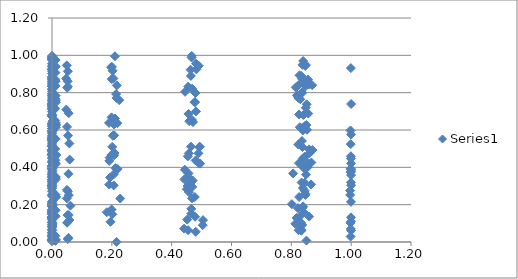
| Category | Series 0 |
|---|---|
| 2.1234767190230094e-10 | 0.426 |
| 2.1823215421288188e-10 | 0.995 |
| 2.456668731822884e-10 | 0.924 |
| 2.4958728359406744e-10 | 0.549 |
| 2.524520583579849e-10 | 0.253 |
| 2.564782472251878e-10 | 0.204 |
| 2.870732689011217e-10 | 0.834 |
| 2.885965554783698e-10 | 0.47 |
| 2.9653796850900167e-10 | 0.982 |
| 3.3178842842110586e-10 | 0.126 |
| 3.3704681758625977e-10 | 0.903 |
| 3.893393559864688e-10 | 0.345 |
| 1.2585277097562478e-08 | 0.543 |
| 1.2900032388252745e-08 | 0.58 |
| 1.3223297873098933e-08 | 0.049 |
| 1.3553554375008077e-08 | 0.816 |
| 1.4356809921003133e-08 | 0.449 |
| 1.4563627409916188e-08 | 0.465 |
| 1.4714552239303248e-08 | 0.729 |
| 1.4926377636556912e-08 | 0.941 |
| 1.508193313565005e-08 | 0.351 |
| 1.5298897629811785e-08 | 0.699 |
| 1.545722449196362e-08 | 0.485 |
| 1.5679434919269443e-08 | 0.598 |
| 1.6525656855001448e-08 | 0.983 |
| 1.6604825753960116e-08 | 0.297 |
| 1.7016893079949853e-08 | 0.163 |
| 1.7356982117070712e-08 | 0.104 |
| 1.744001937821129e-08 | 0.492 |
| 1.7872212247342826e-08 | 0.194 |
| 1.883316387776934e-08 | 0.068 |
| 1.9102404356092215e-08 | 0.305 |
| 1.9777019070746364e-08 | 0.82 |
| 2.0059361231105254e-08 | 0.333 |
| 2.1758160864438958e-08 | 0.542 |
| 2.2844060947465533e-08 | 0.47 |
| 2.962953792870785e-07 | 0.885 |
| 2.9914148461965643e-07 | 0.796 |
| 3.030237865761576e-07 | 0.216 |
| 3.0593233696316057e-07 | 0.555 |
| 3.339704131807069e-07 | 0.433 |
| 3.3716555028355905e-07 | 0.214 |
| 3.3833927319173687e-07 | 0.326 |
| 3.415237559408568e-07 | 0.836 |
| 3.4157478989468423e-07 | 0.159 |
| 3.4478869366710227e-07 | 0.783 |
| 3.4598805156196545e-07 | 0.407 |
| 3.4929421769274587e-07 | 0.858 |
| 3.7950698414280907e-07 | 0.511 |
| 3.8115807225130017e-07 | 0.167 |
| 3.8312210460805484e-07 | 0.009 |
| 3.847883849843472e-07 | 0.136 |
| 3.897399210303014e-07 | 0.681 |
| 3.9344916017753127e-07 | 0.391 |
| 4.273387489324025e-07 | 0.955 |
| 4.3139305175869927e-07 | 0.607 |
| 4.3288230333119326e-07 | 0.172 |
| 4.36987385794526e-07 | 0.681 |
| 4.871827784615834e-07 | 0.085 |
| 4.917840411651853e-07 | 0.515 |
| 5.158962842546905e-07 | 0.872 |
| 5.273908661378575e-07 | 0.153 |
| 5.801973006099032e-07 | 0.569 |
| 5.876443763341788e-07 | 0.374 |
| 5.930714119427855e-07 | 0.093 |
| 6.006778745503318e-07 | 0.194 |
| 6.577298205096262e-07 | 0.738 |
| 6.605375070208675e-07 | 0.062 |
| 6.751272164192693e-07 | 0.491 |
| 7.389758113266109e-07 | 0.149 |
| 7.483801208181899e-07 | 0.806 |
| 8.403777160192567e-07 | 0.406 |
| 8.168316353291611e-06 | 0.625 |
| 8.237543187333576e-06 | 0.028 |
| 8.331844850307904e-06 | 0.862 |
| 8.402397568946187e-06 | 0.755 |
| 8.498948040573692e-06 | 0.106 |
| 8.570854370742046e-06 | 0.794 |
| 8.668804359627521e-06 | 0.76 |
| 8.74208532557326e-06 | 0.015 |
| 9.078450680558126e-06 | 0.731 |
| 9.155041731903718e-06 | 0.052 |
| 9.183154892721936e-06 | 0.131 |
| 9.25937014669387e-06 | 0.394 |
| 9.260590849672614e-06 | 0.53 |
| 9.337420832848237e-06 | 0.272 |
| 9.366069614949815e-06 | 0.636 |
| 9.444227167936512e-06 | 0.672 |
| 9.444980505779504e-06 | 0.013 |
| 9.523767866033207e-06 | 0.03 |
| 9.552963413550078e-06 | 0.19 |
| 9.632112238516318e-06 | 0.619 |
| 9.633379917639643e-06 | 0.393 |
| 9.713165942292591e-06 | 0.4 |
| 9.742916689886628e-06 | 0.915 |
| 9.824862025331277e-06 | 0.287 |
| 1.016197544449026e-05 | 0.785 |
| 1.0200951752832855e-05 | 0.301 |
| 1.0247288593686599e-05 | 0.878 |
| 1.0286577799517056e-05 | 0.496 |
| 1.0403207174730093e-05 | 0.589 |
| 1.0490455995197467e-05 | 0.29 |
| 1.0569373670954163e-05 | 0.835 |
| 1.0609843058416983e-05 | 0.149 |
| 1.0657954581693425e-05 | 0.129 |
| 1.069874824385099e-05 | 0.3 |
| 1.0819841937779522e-05 | 0.033 |
| 1.0910428865148664e-05 | 0.135 |
| 1.1283055302197367e-05 | 0.631 |
| 1.1377346309905233e-05 | 0.745 |
| 1.1411954388964274e-05 | 0.56 |
| 1.1507274824080777e-05 | 0.409 |
| 1.1733292285498697e-05 | 0.71 |
| 1.1831176597832995e-05 | 0.015 |
| 1.1867103178719244e-05 | 0.325 |
| 1.1966054131065482e-05 | 0.038 |
| 1.2664212741042147e-05 | 0.979 |
| 1.2769505812179599e-05 | 0.925 |
| 1.3166942836957334e-05 | 0.334 |
| 1.3276225776885104e-05 | 0.552 |
| 0.00010078741003635494 | 0.849 |
| 0.00010257360776560601 | 0.49 |
| 0.00011067686671965149 | 0.119 |
| 0.00011180675246643151 | 0.205 |
| 0.00011262823636286894 | 0.975 |
| 0.00011377693385019935 | 0.678 |
| 0.00012229719423028143 | 0.363 |
| 0.00012271232885843365 | 0.006 |
| 0.00012486349102413654 | 0.683 |
| 0.00013210220689575646 | 0.005 |
| 0.00013416413977041425 | 0.609 |
| 0.00013551918064536573 | 0.939 |
| 0.00014486286270495028 | 0.082 |
| 0.0001463196175609976 | 0.513 |
| 0.0001485902518405211 | 0.468 |
| 0.00015423402247686702 | 0.251 |
| 0.00015536475922298262 | 0.311 |
| 0.0001569029090660761 | 0.081 |
| 0.00015711821260880348 | 0.996 |
| 0.00015805208311582772 | 0.407 |
| 0.00015983411047032852 | 0.552 |
| 0.00016036852775085997 | 0.492 |
| 0.00016899642213121302 | 0.157 |
| 0.0001702288933191096 | 0.476 |
| 0.00017068091116004505 | 0.317 |
| 0.00017190535384682088 | 0.564 |
| 0.00017192495349044014 | 0.881 |
| 0.000172140010254623 | 0.204 |
| 0.0001731578025000386 | 0.846 |
| 0.0001736171448556469 | 0.52 |
| 0.00017385400233146334 | 0.772 |
| 0.00017488133917184086 | 0.736 |
| 0.00017509987862937736 | 0.362 |
| 0.00017684161747491783 | 0.365 |
| 0.00018630090356949708 | 0.594 |
| 0.0001869183213392837 | 0.716 |
| 0.0001876518988364364 | 0.05 |
| 0.00018827353180017045 | 0.989 |
| 0.00019011685065862665 | 0.451 |
| 0.00019037485358670863 | 0.171 |
| 0.00019149388333101173 | 0.741 |
| 0.0001936290210585602 | 0.198 |
| 0.00020393025979587235 | 0.104 |
| 0.00020540126274414517 | 0.723 |
| 0.00020594073307812606 | 0.927 |
| 0.00020742537710504122 | 0.127 |
| 0.00022530901047051278 | 0.608 |
| 0.0002269246262083097 | 0.591 |
| 0.0012909806634268117 | 0.715 |
| 0.0013104059790640687 | 0.99 |
| 0.0013301535400527089 | 0.195 |
| 0.0013501229074871421 | 0.197 |
| 0.0013978687045086333 | 0.871 |
| 0.0014099811686791091 | 0.132 |
| 0.0014187752138500186 | 0.381 |
| 0.0014310548764355294 | 0.721 |
| 0.0014400264884734239 | 0.992 |
| 0.0014524758815815466 | 0.762 |
| 0.0014615143847470883 | 0.635 |
| 0.0014741351705690152 | 0.355 |
| 0.0015215304335350788 | 0.595 |
| 0.0015259122221885034 | 0.395 |
| 0.0015485798687124859 | 0.568 |
| 0.0015671160807445791 | 0.635 |
| 0.0015716188547498168 | 0.944 |
| 0.0015949118717146502 | 0.091 |
| 0.0016458743404557826 | 0.786 |
| 0.001659956641392135 | 0.796 |
| 0.001694881189109842 | 0.097 |
| 0.001709349415770434 | 0.349 |
| 0.001794660771524913 | 0.647 |
| 0.001847730105941138 | 0.244 |
| 0.009984454081129612 | 0.553 |
| 0.010037427237062533 | 0.77 |
| 0.010667320288995207 | 0.715 |
| 0.010723507396918032 | 0.651 |
| 0.010744083903059806 | 0.871 |
| 0.010800630509623637 | 0.498 |
| 0.01121560143118987 | 0.006 |
| 0.011306021782250463 | 0.424 |
| 0.011354052069222687 | 0.633 |
| 0.01136518939800352 | 0.033 |
| 0.011445462918333567 | 0.347 |
| 0.011472815165988042 | 0.907 |
| 0.011505278075695782 | 0.254 |
| 0.011532757212461456 | 0.438 |
| 0.01197256897235269 | 0.35 |
| 0.0120576187952362 | 0.765 |
| 0.012068384357979405 | 0.756 |
| 0.012119277892294405 | 0.836 |
| 0.01213107890453863 | 0.238 |
| 0.012154037273891662 | 0.784 |
| 0.012205250870732992 | 0.975 |
| 0.01221613321956823 | 0.17 |
| 0.01221712607051357 | 0.138 |
| 0.012279507588326842 | 0.861 |
| 0.012302714778584519 | 0.552 |
| 0.0123664869799283 | 0.638 |
| 0.012834313919855315 | 0.94 |
| 0.012864589249571977 | 0.418 |
| 0.012966700325791057 | 0.626 |
| 0.013020934894183002 | 0.614 |
| 0.013033510317392224 | 0.337 |
| 0.013124142816255922 | 0.749 |
| 0.013191669778072884 | 0.011 |
| 0.013686954525415494 | 0.243 |
| 0.013782695628377545 | 0.63 |
| 0.0146905456387362 | 0.466 |
| 0.047370274794604386 | 0.876 |
| 0.04785159386174785 | 0.709 |
| 0.04929249002107264 | 0.946 |
| 0.04979004416656974 | 0.234 |
| 0.04998773723249543 | 0.279 |
| 0.05027971197334634 | 0.616 |
| 0.05049112695872016 | 0.103 |
| 0.05078554670805108 | 0.826 |
| 0.05199778330887759 | 0.144 |
| 0.05229948692312298 | 0.861 |
| 0.05251793800924415 | 0.016 |
| 0.05282214457087702 | 0.271 |
| 0.052927264588090696 | 0.832 |
| 0.053029795205902994 | 0.915 |
| 0.05355849722431441 | 0.57 |
| 0.055034648582009286 | 0.022 |
| 0.05514055024077493 | 0.365 |
| 0.055686609797058945 | 0.69 |
| 0.0557964296351573 | 0.144 |
| 0.05611627721968993 | 0.251 |
| 0.05799755116743158 | 0.528 |
| 0.05832777293313517 | 0.118 |
| 0.05912694049708494 | 0.441 |
| 0.06143536575637108 | 0.195 |
| 0.18318458572411697 | 0.16 |
| 0.19067220686008254 | 0.638 |
| 0.19121955502431814 | 0.308 |
| 0.1914997487742797 | 0.434 |
| 0.1926482164878131 | 0.452 |
| 0.19400022082517757 | 0.346 |
| 0.19544328850229595 | 0.108 |
| 0.19747504938627253 | 0.936 |
| 0.19893354095475202 | 0.467 |
| 0.19893595342410872 | 0.668 |
| 0.19922152934020415 | 0.174 |
| 0.1997857863560001 | 0.873 |
| 0.20040187683937832 | 0.938 |
| 0.201258450048353 | 0.509 |
| 0.20179126879077575 | 0.148 |
| 0.20265191982640324 | 0.917 |
| 0.2032740734696121 | 0.569 |
| 0.20413905801134702 | 0.648 |
| 0.20536148775498367 | 0.876 |
| 0.20623254057494966 | 0.303 |
| 0.20686219686741716 | 0.363 |
| 0.20744120784172587 | 0.63 |
| 0.20773510399623984 | 0.465 |
| 0.20773758920216262 | 0.571 |
| 0.20924761189285612 | 0.477 |
| 0.21038189496212734 | 0.995 |
| 0.2106786194193851 | 0.661 |
| 0.21220564363092703 | 0.396 |
| 0.21435496994013067 | 0.792 |
| 0.21559571684292564 | 0.772 |
| 0.2158999465526337 | 0.001 |
| 0.21649598288127095 | 0.839 |
| 0.21861396229234936 | 0.636 |
| 0.21952267514975543 | 0.391 |
| 0.22488709431813247 | 0.76 |
| 0.2279914256223844 | 0.233 |
| 0.4416191548099777 | 0.072 |
| 0.4426041606008622 | 0.336 |
| 0.4439346178955026 | 0.387 |
| 0.4449216096849407 | 0.805 |
| 0.45077868287626444 | 0.283 |
| 0.45177138854146665 | 0.12 |
| 0.45311217416841176 | 0.3 |
| 0.4540351723016773 | 0.459 |
| 0.45410677452705567 | 0.35 |
| 0.4550305145855629 | 0.063 |
| 0.455394060673084 | 0.832 |
| 0.45637483563846415 | 0.686 |
| 0.4563904875100915 | 0.367 |
| 0.4573720395127507 | 0.475 |
| 0.45773626263470973 | 0.267 |
| 0.4587345371502176 | 0.647 |
| 0.463288439954147 | 0.923 |
| 0.4642909846875446 | 0.89 |
| 0.46465714988173734 | 0.511 |
| 0.4656449597941666 | 0.178 |
| 0.46566072356891625 | 0.152 |
| 0.46664927024955166 | 0.988 |
| 0.4670160773915513 | 0.997 |
| 0.4674886708158737 | 0.323 |
| 0.4679490304292352 | 0.654 |
| 0.46802140239561624 | 0.234 |
| 0.4684943433255579 | 0.821 |
| 0.4689550403707317 | 0.295 |
| 0.4703136580586718 | 0.33 |
| 0.4713213844367736 | 0.643 |
| 0.4768353608038024 | 0.748 |
| 0.4772987668383699 | 0.241 |
| 0.4778476754391094 | 0.75 |
| 0.4783113993471143 | 0.135 |
| 0.47967888525850405 | 0.799 |
| 0.4801556813814101 | 0.437 |
| 0.480693133346126 | 0.055 |
| 0.48117024967296085 | 0.699 |
| 0.48154078485662827 | 0.955 |
| 0.4825562768378622 | 0.925 |
| 0.4895825543613378 | 0.475 |
| 0.49060321750806185 | 0.944 |
| 0.49097596649102077 | 0.422 |
| 0.49199749234914386 | 0.508 |
| 0.49432622613540483 | 0.51 |
| 0.49534978590253076 | 0.42 |
| 0.5038338106224641 | 0.09 |
| 0.5048628310268446 | 0.117 |
| 0.8018493176403366 | 0.203 |
| 0.80607384298247 | 0.367 |
| 0.8133962390033009 | 0.098 |
| 0.8146392819198448 | 0.828 |
| 0.8175393427745514 | 0.129 |
| 0.8187732143308741 | 0.786 |
| 0.8211496641435778 | 0.835 |
| 0.822047826347537 | 0.181 |
| 0.8232573474126851 | 0.772 |
| 0.8234255376409202 | 0.522 |
| 0.8241519272544026 | 0.063 |
| 0.8252342222584177 | 0.099 |
| 0.8255240990793956 | 0.422 |
| 0.8259320870467077 | 0.683 |
| 0.8261253931030366 | 0.241 |
| 0.827325429055415 | 0.893 |
| 0.8274922939253511 | 0.136 |
| 0.8282129414663207 | 0.615 |
| 0.8295741860157224 | 0.088 |
| 0.829978904605346 | 0.765 |
| 0.8323041310196968 | 0.103 |
| 0.8331827128560072 | 0.061 |
| 0.8335030369271555 | 0.889 |
| 0.8343656725484362 | 0.064 |
| 0.8343794209239799 | 0.854 |
| 0.8345301516304345 | 0.318 |
| 0.8352404636185572 | 0.799 |
| 0.8355593997653347 | 0.541 |
| 0.8357234624169804 | 0.874 |
| 0.8362986531304855 | 0.8 |
| 0.8364319704725586 | 0.611 |
| 0.8365820429519361 | 0.091 |
| 0.8371698394042479 | 0.508 |
| 0.8374874557641412 | 0.949 |
| 0.837770117947575 | 0.184 |
| 0.838342769200135 | 0.289 |
| 0.8383564005186456 | 0.447 |
| 0.8385058471271969 | 0.598 |
| 0.8392100895714747 | 0.191 |
| 0.8395262905988745 | 0.97 |
| 0.8396889439062881 | 0.875 |
| 0.8403913470388022 | 0.68 |
| 0.8405401225109596 | 0.398 |
| 0.8417178812397303 | 0.158 |
| 0.843984930117632 | 0.457 |
| 0.8443772269393203 | 0.317 |
| 0.8448412858677113 | 0.274 |
| 0.8452328039576612 | 0.621 |
| 0.8463845683337314 | 0.944 |
| 0.8465446898535544 | 0.259 |
| 0.8472361266887317 | 0.252 |
| 0.8478773061844884 | 0.834 |
| 0.8482660251045098 | 0.719 |
| 0.8485418033265524 | 0.403 |
| 0.8487258388853264 | 0.949 |
| 0.8491137646427557 | 0.361 |
| 0.8502549036408382 | 0.627 |
| 0.8504135411676331 | 0.008 |
| 0.8510985506001106 | 0.738 |
| 0.85239200442786 | 0.601 |
| 0.8546018115650037 | 0.401 |
| 0.8554363100023183 | 0.424 |
| 0.8557404966328584 | 0.871 |
| 0.8565725514413565 | 0.688 |
| 0.8583937864879279 | 0.844 |
| 0.8592200696576338 | 0.496 |
| 0.8595212496012887 | 0.136 |
| 0.8603450468712057 | 0.475 |
| 0.8660456734593985 | 0.308 |
| 0.8668546828563586 | 0.426 |
| 0.8697206197058698 | 0.84 |
| 0.8705209872297011 | 0.493 |
| 0.996345023391927 | 0.276 |
| 0.9966860274163801 | 0.252 |
| 0.9975934788620632 | 0.102 |
| 0.997868850619734 | 0.597 |
| 0.9979730335775508 | 0.374 |
| 0.9981215458329364 | 0.392 |
| 0.9982251379502641 | 0.029 |
| 0.9983639518012494 | 0.524 |
| 0.9988704155825419 | 0.07 |
| 0.9989806363563407 | 0.932 |
| 0.9990566084614958 | 0.447 |
| 0.9991571061250489 | 0.459 |
| 0.9991904133426093 | 0.32 |
| 0.9992222028055951 | 0.215 |
| 0.9993753161612969 | 0.132 |
| 0.9997099155217073 | 0.421 |
| 0.9997288237949229 | 0.576 |
| 0.9997571618575032 | 0.111 |
| 0.9998158263335495 | 0.358 |
| 0.9998312240720673 | 0.061 |
| 0.9998721202314399 | 0.38 |
| 0.9999827085639968 | 0.389 |
| 0.9999975475486039 | 0.304 |
| 0.9999999862781035 | 0.739 |